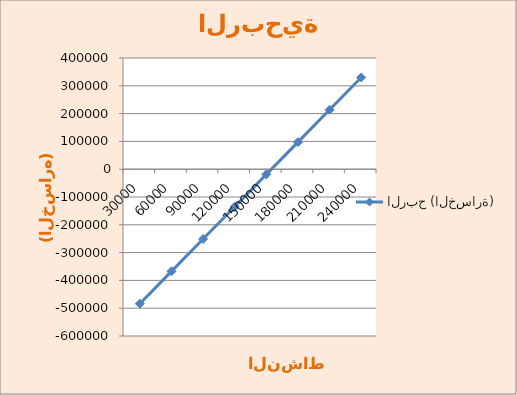
| Category | الربح (الخسارة) |
|---|---|
| 30000.0 | -483750 |
| 60000.0 | -367500 |
| 90000.0 | -251250 |
| 120000.0 | -135000 |
| 150000.0 | -18750 |
| 180000.0 | 97500 |
| 210000.0 | 213750 |
| 240000.0 | 330000 |